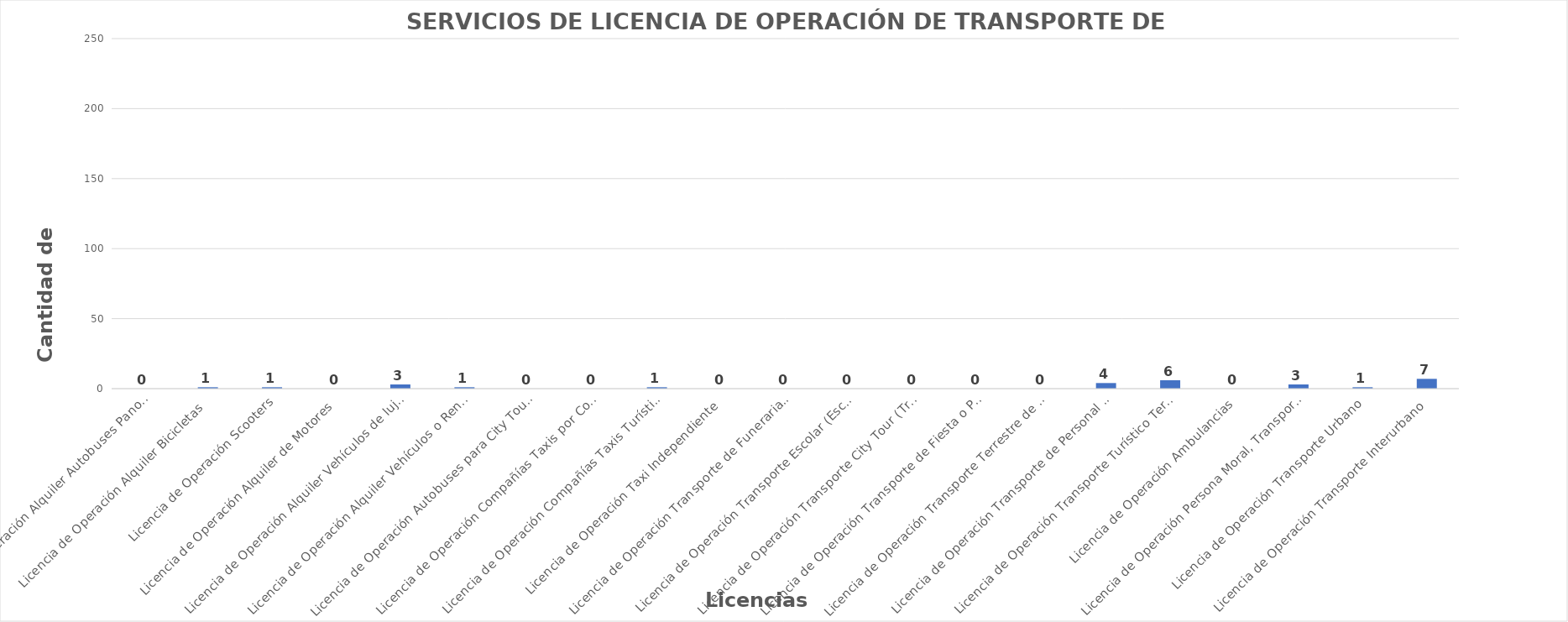
| Category | Series 0 |
|---|---|
| Licencia de Operación Alquiler Autobuses Panorámicos  | 0 |
| Licencia de Operación Alquiler Bicicletas  | 1 |
| Licencia de Operación Scooters | 1 |
| Licencia de Operación Alquiler de Motores  | 0 |
| Licencia de Operación Alquiler Vehículos de lujo y-o Limosina con chofer  | 3 |
| Licencia de Operación Alquiler Vehículos o Rent Car  | 1 |
| Licencia de Operación Autobuses para City Tour (TrolleyBus)  | 0 |
| Licencia de Operación Compañías Taxis por Comunicación  | 0 |
| Licencia de Operación Compañías Taxis Turísticos  | 1 |
| Licencia de Operación Taxi Independiente  | 0 |
| Licencia de Operación Transporte de Funerarias (Persona Física o Moral)  | 0 |
| Licencia de Operación Transporte Escolar (Escuelas Centros Educativos y Universidades)  | 0 |
| Licencia de Operación Transporte City Tour (Tren sobre Ruedas) Persona Física o Moral  | 0 |
| Licencia de Operación Transporte de Fiesta o Party Bus, Persona Física o Moral  | 0 |
| Licencia de Operación Transporte Terrestre de Aventura Camionetas y Camiones y o Jeep Safari Camiones  | 0 |
| Licencia de Operación Transporte de Personal u-o Empresarial  | 4 |
| Licencia de Operación Transporte Turístico Terrestres de Autobuses y Minibuses Persona Física o Moral  | 6 |
| Licencia de Operación Ambulancias | 0 |
| Licencia de Operación Persona Moral, Transporte Turístico Terrestre de Aventura (Four Wheel y Buggy)  | 3 |
| Licencia de Operación Transporte Urbano  | 1 |
| Licencia de Operación Transporte Interurbano  | 7 |